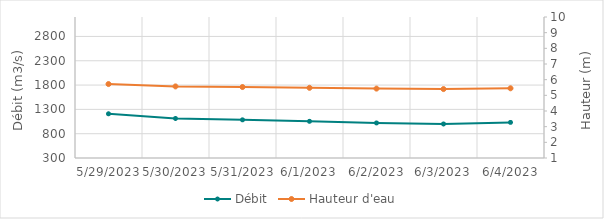
| Category | Débit |
|---|---|
| 5/11/23 | 1852.06 |
| 5/10/23 | 1883.27 |
| 5/9/23 | 1907.49 |
| 5/8/23 | 1788.63 |
| 5/7/23 | 1599.13 |
| 5/6/23 | 1329.98 |
| 5/5/23 | 1250.42 |